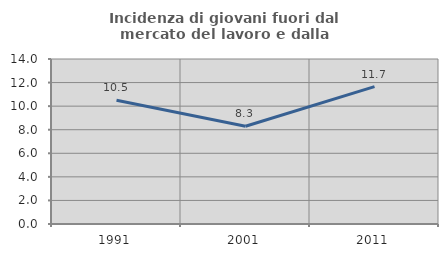
| Category | Incidenza di giovani fuori dal mercato del lavoro e dalla formazione  |
|---|---|
| 1991.0 | 10.501 |
| 2001.0 | 8.294 |
| 2011.0 | 11.65 |